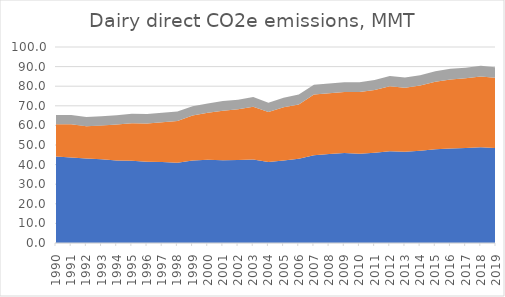
| Category | Dairy cattle enteric CH4, CO2e MMT | Dairy cattle managed manure CH4, CO2e MMT | Dairy cattle managed manure N2O, CO2e MMT |
|---|---|---|---|
| 1990.0 | 44.072 | 16.492 | 4.69 |
| 1991.0 | 43.652 | 16.996 | 4.664 |
| 1992.0 | 43.064 | 16.548 | 4.69 |
| 1993.0 | 42.728 | 17.192 | 4.744 |
| 1994.0 | 42.056 | 18.34 | 4.77 |
| 1995.0 | 41.944 | 19.152 | 4.823 |
| 1996.0 | 41.468 | 19.46 | 4.85 |
| 1997.0 | 41.3 | 20.3 | 4.85 |
| 1998.0 | 40.964 | 21.308 | 4.876 |
| 1999.0 | 42.084 | 22.932 | 4.744 |
| 2000.0 | 42.532 | 23.884 | 4.796 |
| 2001.0 | 42.252 | 25.284 | 4.876 |
| 2002.0 | 42.336 | 25.844 | 4.902 |
| 2003.0 | 42.56 | 26.964 | 4.982 |
| 2004.0 | 41.328 | 25.536 | 4.744 |
| 2005.0 | 42.084 | 27.16 | 4.876 |
| 2006.0 | 42.952 | 27.72 | 5.035 |
| 2007.0 | 44.828 | 30.94 | 5.035 |
| 2008.0 | 45.444 | 30.968 | 4.956 |
| 2009.0 | 45.892 | 31.136 | 5.035 |
| 2010.0 | 45.556 | 31.472 | 5.035 |
| 2011.0 | 46.06 | 32.032 | 5.115 |
| 2012.0 | 46.76 | 33.264 | 5.168 |
| 2013.0 | 46.592 | 32.676 | 5.141 |
| 2014.0 | 47.012 | 33.32 | 5.194 |
| 2015.0 | 47.768 | 34.524 | 5.326 |
| 2016.0 | 48.216 | 35.252 | 5.38 |
| 2017.0 | 48.44 | 35.56 | 5.406 |
| 2018.0 | 48.832 | 36.176 | 5.459 |
| 2019.0 | 48.412 | 35.868 | 5.38 |